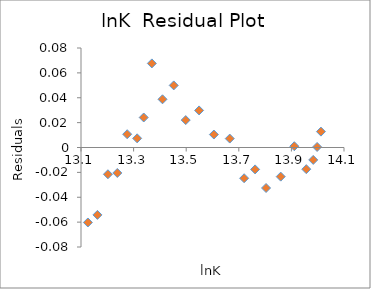
| Category | lnY |
|---|---|
| 1.0 | 11.814 |
| 2.0 | 11.852 |
| 3.0 | 11.903 |
| 4.0 | 11.942 |
| 5.0 | 12.003 |
| 6.0 | 12.047 |
| 7.0 | 12.076 |
| 8.0 | 12.142 |
| 9.0 | 12.174 |
| 10.0 | 12.234 |
| 11.0 | 12.287 |
| 12.0 | 12.338 |
| 13.0 | 12.403 |
| 14.0 | 12.448 |
| 15.0 | 12.462 |
| 16.0 | 12.476 |
| 17.0 | 12.482 |
| 18.0 | 12.536 |
| 19.0 | 12.564 |
| 20.0 | 12.585 |
| 21.0 | 12.597 |
| 22.0 | 12.623 |
| 23.0 | 12.64 |